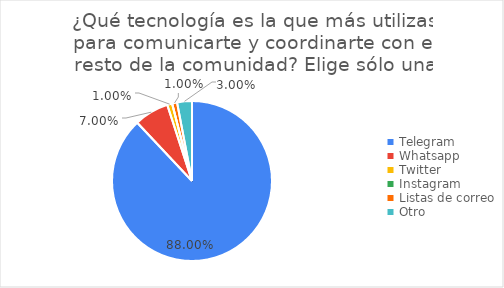
| Category | Series 0 |
|---|---|
| Telegram | 0.88 |
| Whatsapp | 0.07 |
| Twitter | 0.01 |
| Instagram | 0 |
| Listas de correo | 0.01 |
| Otro | 0.03 |